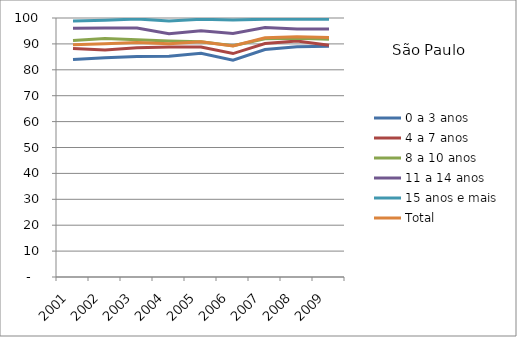
| Category | 0 a 3 anos | 4 a 7 anos | 8 a 10 anos | 11 a 14 anos | 15 anos e mais | Total |
|---|---|---|---|---|---|---|
| 2001.0 | 83.97 | 88.25 | 91.31 | 96.09 | 98.82 | 89.64 |
| 2002.0 | 84.65 | 87.69 | 92.1 | 96.12 | 99.12 | 90.03 |
| 2003.0 | 85.14 | 88.51 | 91.59 | 96.1 | 99.63 | 90.53 |
| 2004.0 | 85.22 | 88.81 | 91.11 | 93.92 | 98.82 | 90.05 |
| 2005.0 | 86.42 | 88.79 | 90.82 | 95.09 | 99.52 | 90.82 |
| 2006.0 | 83.7 | 86.27 | 89.31 | 94 | 99.25 | 89.21 |
| 2007.0 | 87.83 | 90.14 | 91.97 | 96.3 | 99.53 | 92.38 |
| 2008.0 | 88.89 | 91.14 | 92.18 | 95.78 | 99.65 | 92.8 |
| 2009.0 | 89.12 | 89.47 | 91.79 | 95.74 | 99.49 | 92.48 |